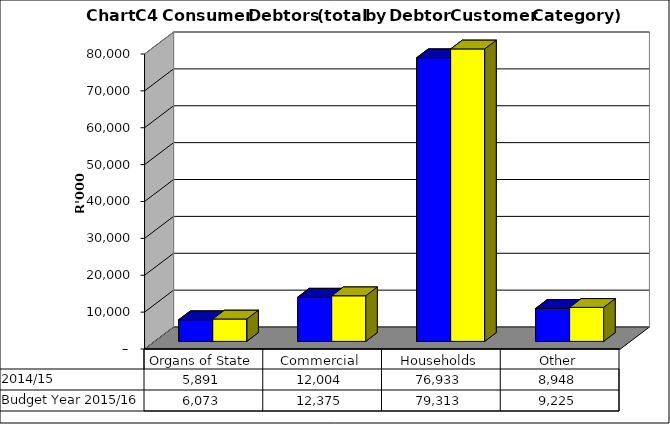
| Category |  2014/15  | Budget Year 2015/16 |
|---|---|---|
| Organs of State | 5890979.75 | 6073175 |
| Commercial | 12004113.75 | 12375375 |
| Households | 76933168.65 | 79312545 |
| Other | 8947893.04 | 9224632 |